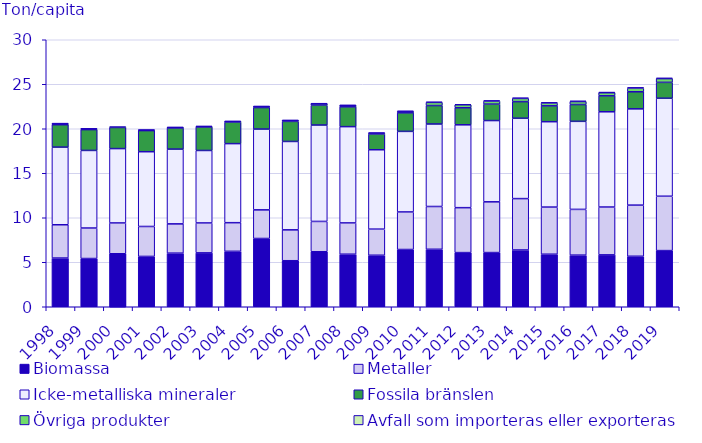
| Category | Biomassa | Metaller | Icke-metalliska mineraler | Fossila bränslen | Övriga produkter | Avfall som importeras eller exporteras |
|---|---|---|---|---|---|---|
| 1998.0 | 5.472 | 3.741 | 8.723 | 2.519 | 0.122 | 0 |
| 1999.0 | 5.418 | 3.428 | 8.719 | 2.34 | 0.088 | 0 |
| 2000.0 | 5.954 | 3.462 | 8.355 | 2.372 | 0.099 | 0 |
| 2001.0 | 5.654 | 3.365 | 8.401 | 2.374 | 0.062 | 0 |
| 2002.0 | 6.023 | 3.291 | 8.398 | 2.382 | 0.059 | 0 |
| 2003.0 | 6.054 | 3.362 | 8.144 | 2.651 | 0.053 | 0 |
| 2004.0 | 6.228 | 3.218 | 8.883 | 2.423 | 0.078 | 0 |
| 2005.0 | 7.669 | 3.218 | 9.077 | 2.418 | 0.122 | 0.002 |
| 2006.0 | 5.171 | 3.471 | 9.93 | 2.256 | 0.11 | 0.001 |
| 2007.0 | 6.18 | 3.406 | 10.832 | 2.219 | 0.177 | 0.001 |
| 2008.0 | 5.904 | 3.517 | 10.817 | 2.227 | 0.166 | 0.003 |
| 2009.0 | 5.787 | 2.934 | 8.921 | 1.764 | 0.11 | 0.017 |
| 2010.0 | 6.431 | 4.221 | 9.051 | 2.085 | 0.167 | 0.031 |
| 2011.0 | 6.458 | 4.806 | 9.27 | 2.071 | 0.357 | 0.049 |
| 2012.0 | 6.083 | 5.049 | 9.31 | 1.912 | 0.341 | 0.056 |
| 2013.0 | 6.087 | 5.704 | 9.13 | 1.845 | 0.346 | 0.058 |
| 2014.0 | 6.379 | 5.773 | 9.03 | 1.866 | 0.36 | 0.068 |
| 2015.0 | 5.904 | 5.296 | 9.593 | 1.781 | 0.324 | 0.068 |
| 2016.0 | 5.8 | 5.14 | 9.893 | 1.887 | 0.338 | 0.071 |
| 2017.0 | 5.829 | 5.376 | 10.702 | 1.793 | 0.347 | 0.075 |
| 2018.0 | 5.673 | 5.747 | 10.816 | 1.92 | 0.418 | 0.072 |
| 2019.0 | 6.309 | 6.109 | 11.012 | 1.784 | 0.422 | 0.075 |